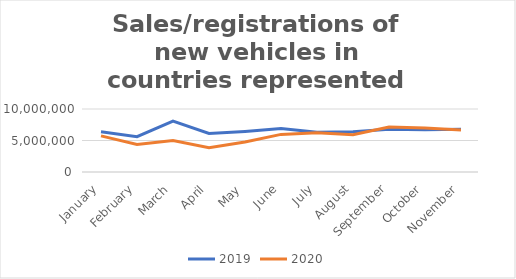
| Category | 2019 | 2020 |
|---|---|---|
| January | 6374305 | 5731761 |
| February | 5602973 | 4366317 |
| March | 8064469 | 4981282 |
| April | 6117693 | 3838945 |
| May | 6445129 | 4775547 |
| June | 6887542 | 5969347 |
| July | 6314198 | 6213773 |
| August | 6381346 | 5909101 |
| September | 6804257 | 7125298 |
| October | 6693682 | 6978857 |
| November | 6787886 | 6683996 |